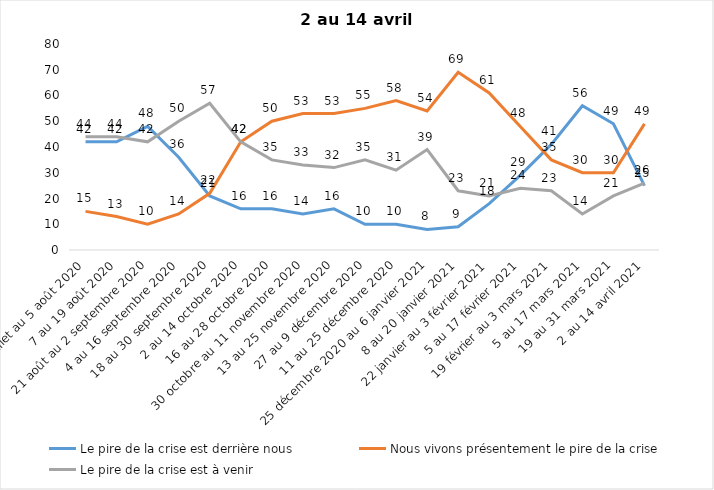
| Category | Le pire de la crise est derrière nous | Nous vivons présentement le pire de la crise | Le pire de la crise est à venir |
|---|---|---|---|
| 24 juillet au 5 août 2020 | 42 | 15 | 44 |
| 7 au 19 août 2020 | 42 | 13 | 44 |
| 21 août au 2 septembre 2020 | 48 | 10 | 42 |
| 4 au 16 septembre 2020 | 36 | 14 | 50 |
| 18 au 30 septembre 2020 | 21 | 22 | 57 |
| 2 au 14 octobre 2020 | 16 | 42 | 42 |
| 16 au 28 octobre 2020 | 16 | 50 | 35 |
| 30 octobre au 11 novembre 2020 | 14 | 53 | 33 |
| 13 au 25 novembre 2020 | 16 | 53 | 32 |
| 27 au 9 décembre 2020 | 10 | 55 | 35 |
| 11 au 25 décembre 2020 | 10 | 58 | 31 |
| 25 décembre 2020 au 6 janvier 2021 | 8 | 54 | 39 |
| 8 au 20 janvier 2021 | 9 | 69 | 23 |
| 22 janvier au 3 février 2021 | 18 | 61 | 21 |
| 5 au 17 février 2021 | 29 | 48 | 24 |
| 19 février au 3 mars 2021 | 41 | 35 | 23 |
| 5 au 17 mars 2021 | 56 | 30 | 14 |
| 19 au 31 mars 2021 | 49 | 30 | 21 |
| 2 au 14 avril 2021 | 25 | 49 | 26 |